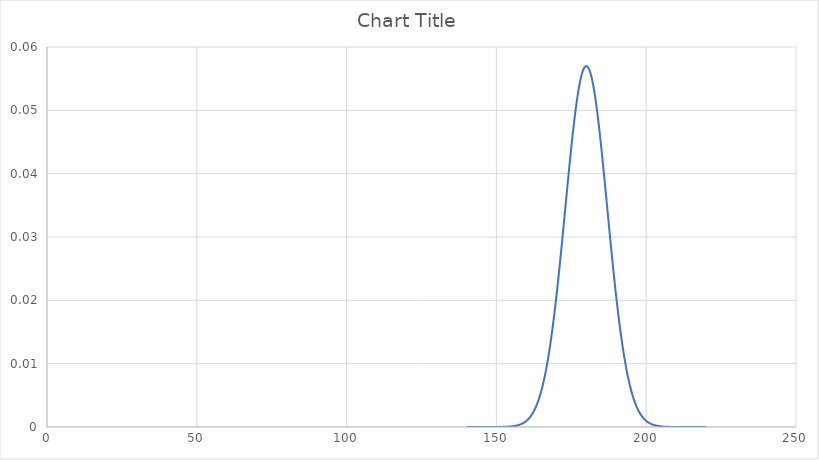
| Category | Series 0 |
|---|---|
| 140.0 | 0 |
| 140.1 | 0 |
| 140.2 | 0 |
| 140.3 | 0 |
| 140.4 | 0 |
| 140.5 | 0 |
| 140.6 | 0 |
| 140.7 | 0 |
| 140.8 | 0 |
| 140.9 | 0 |
| 141.0 | 0 |
| 141.1 | 0 |
| 141.2 | 0 |
| 141.3 | 0 |
| 141.4 | 0 |
| 141.5 | 0 |
| 141.6 | 0 |
| 141.7 | 0 |
| 141.8 | 0 |
| 141.9 | 0 |
| 142.0 | 0 |
| 142.1 | 0 |
| 142.2 | 0 |
| 142.3 | 0 |
| 142.4 | 0 |
| 142.5 | 0 |
| 142.6 | 0 |
| 142.7 | 0 |
| 142.8 | 0 |
| 142.9 | 0 |
| 143.0 | 0 |
| 143.1 | 0 |
| 143.2 | 0 |
| 143.3 | 0 |
| 143.4 | 0 |
| 143.5 | 0 |
| 143.6 | 0 |
| 143.7 | 0 |
| 143.8 | 0 |
| 143.9 | 0 |
| 144.0 | 0 |
| 144.1 | 0 |
| 144.2 | 0 |
| 144.3 | 0 |
| 144.4 | 0 |
| 144.5 | 0 |
| 144.6 | 0 |
| 144.7 | 0 |
| 144.8 | 0 |
| 144.9 | 0 |
| 145.0 | 0 |
| 145.1 | 0 |
| 145.2 | 0 |
| 145.3 | 0 |
| 145.4 | 0 |
| 145.5 | 0 |
| 145.6 | 0 |
| 145.7 | 0 |
| 145.8 | 0 |
| 145.9 | 0 |
| 146.0 | 0 |
| 146.1 | 0 |
| 146.2 | 0 |
| 146.3 | 0 |
| 146.4 | 0 |
| 146.5 | 0 |
| 146.6 | 0 |
| 146.7 | 0 |
| 146.8 | 0 |
| 146.9 | 0 |
| 147.0 | 0 |
| 147.1 | 0 |
| 147.2 | 0 |
| 147.3 | 0 |
| 147.4 | 0 |
| 147.5 | 0 |
| 147.6 | 0 |
| 147.7 | 0 |
| 147.8 | 0 |
| 147.9 | 0 |
| 148.0 | 0 |
| 148.1 | 0 |
| 148.2 | 0 |
| 148.3 | 0 |
| 148.4 | 0 |
| 148.5 | 0 |
| 148.6 | 0 |
| 148.7 | 0 |
| 148.799999999999 | 0 |
| 148.899999999999 | 0 |
| 148.999999999999 | 0 |
| 149.099999999999 | 0 |
| 149.199999999999 | 0 |
| 149.299999999999 | 0 |
| 149.399999999999 | 0 |
| 149.499999999999 | 0 |
| 149.599999999999 | 0 |
| 149.699999999999 | 0 |
| 149.799999999999 | 0 |
| 149.899999999999 | 0 |
| 149.999999999999 | 0 |
| 150.099999999999 | 0 |
| 150.199999999999 | 0 |
| 150.299999999999 | 0 |
| 150.399999999999 | 0 |
| 150.499999999999 | 0 |
| 150.599999999999 | 0 |
| 150.699999999999 | 0 |
| 150.799999999999 | 0 |
| 150.899999999999 | 0 |
| 150.999999999999 | 0 |
| 151.099999999999 | 0 |
| 151.199999999999 | 0 |
| 151.299999999999 | 0 |
| 151.399999999999 | 0 |
| 151.499999999999 | 0 |
| 151.599999999999 | 0 |
| 151.699999999999 | 0 |
| 151.799999999999 | 0 |
| 151.899999999999 | 0 |
| 151.999999999999 | 0 |
| 152.099999999999 | 0 |
| 152.199999999999 | 0 |
| 152.299999999999 | 0 |
| 152.399999999999 | 0 |
| 152.499999999999 | 0 |
| 152.599999999999 | 0 |
| 152.699999999999 | 0 |
| 152.799999999999 | 0 |
| 152.899999999999 | 0 |
| 152.999999999999 | 0 |
| 153.099999999999 | 0 |
| 153.199999999999 | 0 |
| 153.299999999999 | 0 |
| 153.399999999999 | 0 |
| 153.499999999999 | 0 |
| 153.599999999999 | 0 |
| 153.699999999999 | 0 |
| 153.799999999999 | 0 |
| 153.899999999999 | 0 |
| 153.999999999999 | 0 |
| 154.099999999999 | 0 |
| 154.199999999999 | 0 |
| 154.299999999999 | 0 |
| 154.399999999999 | 0 |
| 154.499999999999 | 0 |
| 154.599999999999 | 0 |
| 154.699999999999 | 0 |
| 154.799999999999 | 0 |
| 154.899999999999 | 0 |
| 154.999999999999 | 0 |
| 155.099999999999 | 0 |
| 155.199999999999 | 0 |
| 155.299999999999 | 0 |
| 155.399999999999 | 0 |
| 155.499999999999 | 0 |
| 155.599999999999 | 0 |
| 155.699999999999 | 0 |
| 155.799999999999 | 0 |
| 155.899999999999 | 0 |
| 155.999999999999 | 0 |
| 156.099999999999 | 0 |
| 156.199999999999 | 0 |
| 156.299999999999 | 0 |
| 156.399999999999 | 0 |
| 156.499999999999 | 0 |
| 156.599999999999 | 0 |
| 156.699999999999 | 0 |
| 156.799999999999 | 0 |
| 156.899999999999 | 0 |
| 156.999999999999 | 0 |
| 157.099999999999 | 0 |
| 157.199999999999 | 0 |
| 157.299999999999 | 0 |
| 157.399999999999 | 0 |
| 157.499999999999 | 0 |
| 157.599999999999 | 0 |
| 157.699999999999 | 0 |
| 157.799999999999 | 0 |
| 157.899999999999 | 0 |
| 157.999999999999 | 0 |
| 158.099999999999 | 0 |
| 158.199999999999 | 0 |
| 158.299999999999 | 0 |
| 158.399999999999 | 0 |
| 158.499999999999 | 0.001 |
| 158.599999999999 | 0.001 |
| 158.699999999999 | 0.001 |
| 158.799999999999 | 0.001 |
| 158.899999999999 | 0.001 |
| 158.999999999999 | 0.001 |
| 159.099999999999 | 0.001 |
| 159.199999999999 | 0.001 |
| 159.299999999999 | 0.001 |
| 159.399999999999 | 0.001 |
| 159.499999999999 | 0.001 |
| 159.599999999999 | 0.001 |
| 159.699999999999 | 0.001 |
| 159.799999999999 | 0.001 |
| 159.899999999999 | 0.001 |
| 159.999999999999 | 0.001 |
| 160.099999999999 | 0.001 |
| 160.199999999999 | 0.001 |
| 160.299999999999 | 0.001 |
| 160.399999999999 | 0.001 |
| 160.499999999999 | 0.001 |
| 160.599999999999 | 0.001 |
| 160.699999999999 | 0.001 |
| 160.799999999999 | 0.001 |
| 160.899999999999 | 0.001 |
| 160.999999999999 | 0.001 |
| 161.099999999999 | 0.001 |
| 161.199999999999 | 0.002 |
| 161.299999999999 | 0.002 |
| 161.399999999999 | 0.002 |
| 161.499999999999 | 0.002 |
| 161.599999999999 | 0.002 |
| 161.699999999999 | 0.002 |
| 161.799999999999 | 0.002 |
| 161.899999999999 | 0.002 |
| 161.999999999999 | 0.002 |
| 162.099999999999 | 0.002 |
| 162.199999999999 | 0.002 |
| 162.299999999999 | 0.002 |
| 162.399999999999 | 0.002 |
| 162.499999999999 | 0.003 |
| 162.599999999999 | 0.003 |
| 162.699999999999 | 0.003 |
| 162.799999999999 | 0.003 |
| 162.899999999999 | 0.003 |
| 162.999999999999 | 0.003 |
| 163.099999999999 | 0.003 |
| 163.199999999999 | 0.003 |
| 163.299999999999 | 0.003 |
| 163.399999999999 | 0.003 |
| 163.499999999999 | 0.004 |
| 163.599999999999 | 0.004 |
| 163.699999999999 | 0.004 |
| 163.799999999999 | 0.004 |
| 163.899999999999 | 0.004 |
| 163.999999999999 | 0.004 |
| 164.099999999999 | 0.004 |
| 164.199999999999 | 0.004 |
| 164.299999999999 | 0.005 |
| 164.399999999999 | 0.005 |
| 164.499999999999 | 0.005 |
| 164.599999999999 | 0.005 |
| 164.699999999999 | 0.005 |
| 164.799999999999 | 0.005 |
| 164.899999999999 | 0.006 |
| 164.999999999999 | 0.006 |
| 165.099999999999 | 0.006 |
| 165.199999999999 | 0.006 |
| 165.299999999999 | 0.006 |
| 165.399999999999 | 0.006 |
| 165.499999999999 | 0.007 |
| 165.599999999998 | 0.007 |
| 165.699999999999 | 0.007 |
| 165.799999999999 | 0.007 |
| 165.899999999998 | 0.007 |
| 165.999999999998 | 0.008 |
| 166.099999999998 | 0.008 |
| 166.199999999999 | 0.008 |
| 166.299999999999 | 0.008 |
| 166.399999999998 | 0.009 |
| 166.499999999998 | 0.009 |
| 166.599999999998 | 0.009 |
| 166.699999999999 | 0.009 |
| 166.799999999999 | 0.01 |
| 166.899999999998 | 0.01 |
| 166.999999999998 | 0.01 |
| 167.099999999998 | 0.01 |
| 167.199999999999 | 0.011 |
| 167.299999999998 | 0.011 |
| 167.399999999998 | 0.011 |
| 167.499999999998 | 0.012 |
| 167.599999999998 | 0.012 |
| 167.699999999998 | 0.012 |
| 167.799999999998 | 0.012 |
| 167.899999999998 | 0.013 |
| 167.999999999998 | 0.013 |
| 168.099999999998 | 0.013 |
| 168.199999999998 | 0.014 |
| 168.299999999998 | 0.014 |
| 168.399999999998 | 0.014 |
| 168.499999999998 | 0.015 |
| 168.599999999998 | 0.015 |
| 168.699999999998 | 0.015 |
| 168.799999999998 | 0.016 |
| 168.899999999998 | 0.016 |
| 168.999999999998 | 0.017 |
| 169.099999999998 | 0.017 |
| 169.199999999998 | 0.017 |
| 169.299999999998 | 0.018 |
| 169.399999999998 | 0.018 |
| 169.499999999998 | 0.019 |
| 169.599999999998 | 0.019 |
| 169.699999999998 | 0.019 |
| 169.799999999998 | 0.02 |
| 169.899999999998 | 0.02 |
| 169.999999999998 | 0.021 |
| 170.099999999998 | 0.021 |
| 170.199999999998 | 0.021 |
| 170.299999999998 | 0.022 |
| 170.399999999998 | 0.022 |
| 170.499999999998 | 0.023 |
| 170.599999999998 | 0.023 |
| 170.699999999998 | 0.024 |
| 170.799999999998 | 0.024 |
| 170.899999999998 | 0.024 |
| 170.999999999998 | 0.025 |
| 171.099999999998 | 0.025 |
| 171.199999999998 | 0.026 |
| 171.299999999998 | 0.026 |
| 171.399999999998 | 0.027 |
| 171.499999999998 | 0.027 |
| 171.599999999998 | 0.028 |
| 171.699999999998 | 0.028 |
| 171.799999999998 | 0.029 |
| 171.899999999998 | 0.029 |
| 171.999999999998 | 0.03 |
| 172.099999999998 | 0.03 |
| 172.199999999998 | 0.031 |
| 172.299999999998 | 0.031 |
| 172.399999999998 | 0.032 |
| 172.499999999998 | 0.032 |
| 172.599999999998 | 0.033 |
| 172.699999999998 | 0.033 |
| 172.799999999998 | 0.034 |
| 172.899999999998 | 0.034 |
| 172.999999999998 | 0.035 |
| 173.099999999998 | 0.035 |
| 173.199999999998 | 0.036 |
| 173.299999999998 | 0.036 |
| 173.399999999998 | 0.037 |
| 173.499999999998 | 0.037 |
| 173.599999999998 | 0.038 |
| 173.699999999998 | 0.038 |
| 173.799999999998 | 0.039 |
| 173.899999999998 | 0.039 |
| 173.999999999998 | 0.039 |
| 174.099999999998 | 0.04 |
| 174.199999999998 | 0.04 |
| 174.299999999998 | 0.041 |
| 174.399999999998 | 0.041 |
| 174.499999999998 | 0.042 |
| 174.599999999998 | 0.042 |
| 174.699999999998 | 0.043 |
| 174.799999999998 | 0.043 |
| 174.899999999998 | 0.044 |
| 174.999999999998 | 0.044 |
| 175.099999999998 | 0.045 |
| 175.199999999998 | 0.045 |
| 175.299999999998 | 0.045 |
| 175.399999999998 | 0.046 |
| 175.499999999998 | 0.046 |
| 175.599999999998 | 0.047 |
| 175.699999999998 | 0.047 |
| 175.799999999998 | 0.048 |
| 175.899999999998 | 0.048 |
| 175.999999999998 | 0.048 |
| 176.099999999998 | 0.049 |
| 176.199999999998 | 0.049 |
| 176.299999999998 | 0.05 |
| 176.399999999998 | 0.05 |
| 176.499999999998 | 0.05 |
| 176.599999999998 | 0.051 |
| 176.699999999998 | 0.051 |
| 176.799999999998 | 0.051 |
| 176.899999999998 | 0.052 |
| 176.999999999998 | 0.052 |
| 177.099999999998 | 0.052 |
| 177.199999999998 | 0.053 |
| 177.299999999998 | 0.053 |
| 177.399999999998 | 0.053 |
| 177.499999999998 | 0.053 |
| 177.599999999998 | 0.054 |
| 177.699999999998 | 0.054 |
| 177.799999999998 | 0.054 |
| 177.899999999998 | 0.054 |
| 177.999999999998 | 0.055 |
| 178.099999999998 | 0.055 |
| 178.199999999998 | 0.055 |
| 178.299999999998 | 0.055 |
| 178.399999999998 | 0.056 |
| 178.499999999998 | 0.056 |
| 178.599999999998 | 0.056 |
| 178.699999999998 | 0.056 |
| 178.799999999998 | 0.056 |
| 178.899999999998 | 0.056 |
| 178.999999999998 | 0.056 |
| 179.099999999998 | 0.057 |
| 179.199999999998 | 0.057 |
| 179.299999999998 | 0.057 |
| 179.399999999998 | 0.057 |
| 179.499999999998 | 0.057 |
| 179.599999999998 | 0.057 |
| 179.699999999998 | 0.057 |
| 179.799999999998 | 0.057 |
| 179.899999999998 | 0.057 |
| 179.999999999998 | 0.057 |
| 180.099999999998 | 0.057 |
| 180.199999999998 | 0.057 |
| 180.299999999998 | 0.057 |
| 180.399999999998 | 0.057 |
| 180.499999999998 | 0.057 |
| 180.599999999998 | 0.057 |
| 180.699999999998 | 0.057 |
| 180.799999999998 | 0.057 |
| 180.899999999998 | 0.057 |
| 180.999999999998 | 0.056 |
| 181.099999999998 | 0.056 |
| 181.199999999998 | 0.056 |
| 181.299999999998 | 0.056 |
| 181.399999999998 | 0.056 |
| 181.499999999998 | 0.056 |
| 181.599999999998 | 0.056 |
| 181.699999999998 | 0.055 |
| 181.799999999998 | 0.055 |
| 181.899999999998 | 0.055 |
| 181.999999999998 | 0.055 |
| 182.099999999998 | 0.054 |
| 182.199999999998 | 0.054 |
| 182.299999999998 | 0.054 |
| 182.399999999998 | 0.054 |
| 182.499999999998 | 0.053 |
| 182.599999999998 | 0.053 |
| 182.699999999998 | 0.053 |
| 182.799999999998 | 0.053 |
| 182.899999999998 | 0.052 |
| 182.999999999998 | 0.052 |
| 183.099999999998 | 0.052 |
| 183.199999999997 | 0.051 |
| 183.299999999998 | 0.051 |
| 183.399999999998 | 0.051 |
| 183.499999999997 | 0.05 |
| 183.599999999997 | 0.05 |
| 183.699999999997 | 0.05 |
| 183.799999999998 | 0.049 |
| 183.899999999998 | 0.049 |
| 183.999999999997 | 0.048 |
| 184.099999999997 | 0.048 |
| 184.199999999997 | 0.048 |
| 184.299999999998 | 0.047 |
| 184.399999999998 | 0.047 |
| 184.499999999997 | 0.046 |
| 184.599999999997 | 0.046 |
| 184.699999999997 | 0.045 |
| 184.799999999998 | 0.045 |
| 184.899999999997 | 0.045 |
| 184.999999999997 | 0.044 |
| 185.099999999997 | 0.044 |
| 185.199999999997 | 0.043 |
| 185.299999999997 | 0.043 |
| 185.399999999997 | 0.042 |
| 185.499999999997 | 0.042 |
| 185.599999999997 | 0.041 |
| 185.699999999997 | 0.041 |
| 185.799999999997 | 0.04 |
| 185.899999999997 | 0.04 |
| 185.999999999997 | 0.039 |
| 186.099999999997 | 0.039 |
| 186.199999999997 | 0.039 |
| 186.299999999997 | 0.038 |
| 186.399999999997 | 0.038 |
| 186.499999999997 | 0.037 |
| 186.599999999997 | 0.037 |
| 186.699999999997 | 0.036 |
| 186.799999999997 | 0.036 |
| 186.899999999997 | 0.035 |
| 186.999999999997 | 0.035 |
| 187.099999999997 | 0.034 |
| 187.199999999997 | 0.034 |
| 187.299999999997 | 0.033 |
| 187.399999999997 | 0.033 |
| 187.499999999997 | 0.032 |
| 187.599999999997 | 0.032 |
| 187.699999999997 | 0.031 |
| 187.799999999997 | 0.031 |
| 187.899999999997 | 0.03 |
| 187.999999999997 | 0.03 |
| 188.099999999997 | 0.029 |
| 188.199999999997 | 0.029 |
| 188.299999999997 | 0.028 |
| 188.399999999997 | 0.028 |
| 188.499999999997 | 0.027 |
| 188.599999999997 | 0.027 |
| 188.699999999997 | 0.026 |
| 188.799999999997 | 0.026 |
| 188.899999999997 | 0.025 |
| 188.999999999997 | 0.025 |
| 189.099999999997 | 0.024 |
| 189.199999999997 | 0.024 |
| 189.299999999997 | 0.024 |
| 189.399999999997 | 0.023 |
| 189.499999999997 | 0.023 |
| 189.599999999997 | 0.022 |
| 189.699999999997 | 0.022 |
| 189.799999999997 | 0.021 |
| 189.899999999997 | 0.021 |
| 189.999999999997 | 0.021 |
| 190.099999999997 | 0.02 |
| 190.199999999997 | 0.02 |
| 190.299999999997 | 0.019 |
| 190.399999999997 | 0.019 |
| 190.499999999997 | 0.019 |
| 190.599999999997 | 0.018 |
| 190.699999999997 | 0.018 |
| 190.799999999997 | 0.017 |
| 190.899999999997 | 0.017 |
| 190.999999999997 | 0.017 |
| 191.099999999997 | 0.016 |
| 191.199999999997 | 0.016 |
| 191.299999999997 | 0.015 |
| 191.399999999997 | 0.015 |
| 191.499999999997 | 0.015 |
| 191.599999999997 | 0.014 |
| 191.699999999997 | 0.014 |
| 191.799999999997 | 0.014 |
| 191.899999999997 | 0.013 |
| 191.999999999997 | 0.013 |
| 192.099999999997 | 0.013 |
| 192.199999999997 | 0.012 |
| 192.299999999997 | 0.012 |
| 192.399999999997 | 0.012 |
| 192.499999999997 | 0.012 |
| 192.599999999997 | 0.011 |
| 192.699999999997 | 0.011 |
| 192.799999999997 | 0.011 |
| 192.899999999997 | 0.01 |
| 192.999999999997 | 0.01 |
| 193.099999999997 | 0.01 |
| 193.199999999997 | 0.01 |
| 193.299999999997 | 0.009 |
| 193.399999999997 | 0.009 |
| 193.499999999997 | 0.009 |
| 193.599999999997 | 0.009 |
| 193.699999999997 | 0.008 |
| 193.799999999997 | 0.008 |
| 193.899999999997 | 0.008 |
| 193.999999999997 | 0.008 |
| 194.099999999997 | 0.007 |
| 194.199999999997 | 0.007 |
| 194.299999999997 | 0.007 |
| 194.399999999997 | 0.007 |
| 194.499999999997 | 0.007 |
| 194.599999999997 | 0.006 |
| 194.699999999997 | 0.006 |
| 194.799999999997 | 0.006 |
| 194.899999999997 | 0.006 |
| 194.999999999997 | 0.006 |
| 195.099999999997 | 0.006 |
| 195.199999999997 | 0.005 |
| 195.299999999997 | 0.005 |
| 195.399999999997 | 0.005 |
| 195.499999999997 | 0.005 |
| 195.599999999997 | 0.005 |
| 195.699999999997 | 0.005 |
| 195.799999999997 | 0.004 |
| 195.899999999997 | 0.004 |
| 195.999999999997 | 0.004 |
| 196.099999999997 | 0.004 |
| 196.199999999997 | 0.004 |
| 196.299999999997 | 0.004 |
| 196.399999999997 | 0.004 |
| 196.499999999997 | 0.004 |
| 196.599999999997 | 0.003 |
| 196.699999999997 | 0.003 |
| 196.799999999997 | 0.003 |
| 196.899999999997 | 0.003 |
| 196.999999999997 | 0.003 |
| 197.099999999997 | 0.003 |
| 197.199999999997 | 0.003 |
| 197.299999999997 | 0.003 |
| 197.399999999997 | 0.003 |
| 197.499999999997 | 0.003 |
| 197.599999999997 | 0.002 |
| 197.699999999997 | 0.002 |
| 197.799999999997 | 0.002 |
| 197.899999999997 | 0.002 |
| 197.999999999997 | 0.002 |
| 198.099999999997 | 0.002 |
| 198.199999999997 | 0.002 |
| 198.299999999997 | 0.002 |
| 198.399999999997 | 0.002 |
| 198.499999999997 | 0.002 |
| 198.599999999997 | 0.002 |
| 198.699999999997 | 0.002 |
| 198.799999999997 | 0.002 |
| 198.899999999997 | 0.001 |
| 198.999999999997 | 0.001 |
| 199.099999999997 | 0.001 |
| 199.199999999997 | 0.001 |
| 199.299999999997 | 0.001 |
| 199.399999999997 | 0.001 |
| 199.499999999997 | 0.001 |
| 199.599999999997 | 0.001 |
| 199.699999999997 | 0.001 |
| 199.799999999997 | 0.001 |
| 199.899999999997 | 0.001 |
| 199.999999999997 | 0.001 |
| 200.099999999997 | 0.001 |
| 200.199999999997 | 0.001 |
| 200.299999999997 | 0.001 |
| 200.399999999997 | 0.001 |
| 200.499999999997 | 0.001 |
| 200.599999999997 | 0.001 |
| 200.699999999996 | 0.001 |
| 200.799999999996 | 0.001 |
| 200.899999999997 | 0.001 |
| 200.999999999997 | 0.001 |
| 201.099999999996 | 0.001 |
| 201.199999999996 | 0.001 |
| 201.299999999996 | 0.001 |
| 201.399999999997 | 0.001 |
| 201.499999999997 | 0.001 |
| 201.599999999996 | 0 |
| 201.699999999996 | 0 |
| 201.799999999996 | 0 |
| 201.899999999997 | 0 |
| 201.999999999997 | 0 |
| 202.099999999996 | 0 |
| 202.199999999996 | 0 |
| 202.299999999996 | 0 |
| 202.399999999997 | 0 |
| 202.499999999996 | 0 |
| 202.599999999996 | 0 |
| 202.699999999996 | 0 |
| 202.799999999996 | 0 |
| 202.899999999996 | 0 |
| 202.999999999996 | 0 |
| 203.099999999996 | 0 |
| 203.199999999996 | 0 |
| 203.299999999996 | 0 |
| 203.399999999996 | 0 |
| 203.499999999996 | 0 |
| 203.599999999996 | 0 |
| 203.699999999996 | 0 |
| 203.799999999996 | 0 |
| 203.899999999996 | 0 |
| 203.999999999996 | 0 |
| 204.099999999996 | 0 |
| 204.199999999996 | 0 |
| 204.299999999996 | 0 |
| 204.399999999996 | 0 |
| 204.499999999996 | 0 |
| 204.599999999996 | 0 |
| 204.699999999996 | 0 |
| 204.799999999996 | 0 |
| 204.899999999996 | 0 |
| 204.999999999996 | 0 |
| 205.099999999996 | 0 |
| 205.199999999996 | 0 |
| 205.299999999996 | 0 |
| 205.399999999996 | 0 |
| 205.499999999996 | 0 |
| 205.599999999996 | 0 |
| 205.699999999996 | 0 |
| 205.799999999996 | 0 |
| 205.899999999996 | 0 |
| 205.999999999996 | 0 |
| 206.099999999996 | 0 |
| 206.199999999996 | 0 |
| 206.299999999996 | 0 |
| 206.399999999996 | 0 |
| 206.499999999996 | 0 |
| 206.599999999996 | 0 |
| 206.699999999996 | 0 |
| 206.799999999996 | 0 |
| 206.899999999996 | 0 |
| 206.999999999996 | 0 |
| 207.099999999996 | 0 |
| 207.199999999996 | 0 |
| 207.299999999996 | 0 |
| 207.399999999996 | 0 |
| 207.499999999996 | 0 |
| 207.599999999996 | 0 |
| 207.699999999996 | 0 |
| 207.799999999996 | 0 |
| 207.899999999996 | 0 |
| 207.999999999996 | 0 |
| 208.099999999996 | 0 |
| 208.199999999996 | 0 |
| 208.299999999996 | 0 |
| 208.399999999996 | 0 |
| 208.499999999996 | 0 |
| 208.599999999996 | 0 |
| 208.699999999996 | 0 |
| 208.799999999996 | 0 |
| 208.899999999996 | 0 |
| 208.999999999996 | 0 |
| 209.099999999996 | 0 |
| 209.199999999996 | 0 |
| 209.299999999996 | 0 |
| 209.399999999996 | 0 |
| 209.499999999996 | 0 |
| 209.599999999996 | 0 |
| 209.699999999996 | 0 |
| 209.799999999996 | 0 |
| 209.899999999996 | 0 |
| 209.999999999996 | 0 |
| 210.099999999996 | 0 |
| 210.199999999996 | 0 |
| 210.299999999996 | 0 |
| 210.399999999996 | 0 |
| 210.499999999996 | 0 |
| 210.599999999996 | 0 |
| 210.699999999996 | 0 |
| 210.799999999996 | 0 |
| 210.899999999996 | 0 |
| 210.999999999996 | 0 |
| 211.099999999996 | 0 |
| 211.199999999996 | 0 |
| 211.299999999996 | 0 |
| 211.399999999996 | 0 |
| 211.499999999996 | 0 |
| 211.599999999996 | 0 |
| 211.699999999996 | 0 |
| 211.799999999996 | 0 |
| 211.899999999996 | 0 |
| 211.999999999996 | 0 |
| 212.099999999996 | 0 |
| 212.199999999996 | 0 |
| 212.299999999996 | 0 |
| 212.399999999996 | 0 |
| 212.499999999996 | 0 |
| 212.599999999996 | 0 |
| 212.699999999996 | 0 |
| 212.799999999996 | 0 |
| 212.899999999996 | 0 |
| 212.999999999996 | 0 |
| 213.099999999996 | 0 |
| 213.199999999996 | 0 |
| 213.299999999996 | 0 |
| 213.399999999996 | 0 |
| 213.499999999996 | 0 |
| 213.599999999996 | 0 |
| 213.699999999996 | 0 |
| 213.799999999996 | 0 |
| 213.899999999996 | 0 |
| 213.999999999996 | 0 |
| 214.099999999996 | 0 |
| 214.199999999996 | 0 |
| 214.299999999996 | 0 |
| 214.399999999996 | 0 |
| 214.499999999996 | 0 |
| 214.599999999996 | 0 |
| 214.699999999996 | 0 |
| 214.799999999996 | 0 |
| 214.899999999996 | 0 |
| 214.999999999996 | 0 |
| 215.099999999996 | 0 |
| 215.199999999996 | 0 |
| 215.299999999996 | 0 |
| 215.399999999996 | 0 |
| 215.499999999996 | 0 |
| 215.599999999996 | 0 |
| 215.699999999996 | 0 |
| 215.799999999996 | 0 |
| 215.899999999996 | 0 |
| 215.999999999996 | 0 |
| 216.099999999996 | 0 |
| 216.199999999996 | 0 |
| 216.299999999996 | 0 |
| 216.399999999996 | 0 |
| 216.499999999996 | 0 |
| 216.599999999996 | 0 |
| 216.699999999996 | 0 |
| 216.799999999996 | 0 |
| 216.899999999996 | 0 |
| 216.999999999996 | 0 |
| 217.099999999996 | 0 |
| 217.199999999996 | 0 |
| 217.299999999996 | 0 |
| 217.399999999996 | 0 |
| 217.499999999996 | 0 |
| 217.599999999996 | 0 |
| 217.699999999996 | 0 |
| 217.799999999996 | 0 |
| 217.899999999996 | 0 |
| 217.999999999996 | 0 |
| 218.099999999996 | 0 |
| 218.199999999996 | 0 |
| 218.299999999996 | 0 |
| 218.399999999995 | 0 |
| 218.499999999996 | 0 |
| 218.599999999996 | 0 |
| 218.699999999995 | 0 |
| 218.799999999996 | 0 |
| 218.899999999995 | 0 |
| 218.999999999996 | 0 |
| 219.099999999996 | 0 |
| 219.199999999995 | 0 |
| 219.299999999996 | 0 |
| 219.399999999995 | 0 |
| 219.499999999996 | 0 |
| 219.599999999996 | 0 |
| 219.699999999995 | 0 |
| 219.799999999996 | 0 |
| 219.899999999995 | 0 |
| 219.999999999996 | 0 |